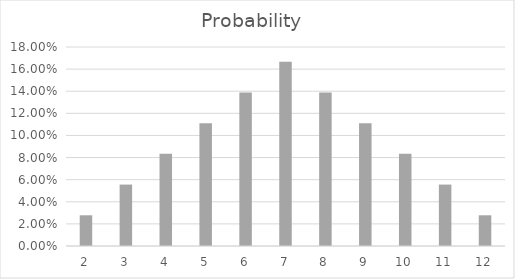
| Category | Probability  |
|---|---|
| 2.0 | 0.028 |
| 3.0 | 0.056 |
| 4.0 | 0.083 |
| 5.0 | 0.111 |
| 6.0 | 0.139 |
| 7.0 | 0.167 |
| 8.0 | 0.139 |
| 9.0 | 0.111 |
| 10.0 | 0.083 |
| 11.0 | 0.056 |
| 12.0 | 0.028 |